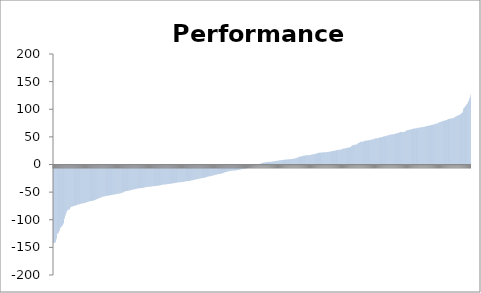
| Category | Series 0 |
|---|---|
| 0 | -141.152 |
| 1 | -140.612 |
| 2 | -140.332 |
| 3 | -139.602 |
| 4 | -139.222 |
| 5 | -138.582 |
| 6 | -133.712 |
| 7 | -131.642 |
| 8 | -123.992 |
| 9 | -122.942 |
| 10 | -122.612 |
| 11 | -121.252 |
| 12 | -118.902 |
| 13 | -118.055 |
| 14 | -113.951 |
| 15 | -112.112 |
| 16 | -111.724 |
| 17 | -110.475 |
| 18 | -109.845 |
| 19 | -108.628 |
| 20 | -107.068 |
| 21 | -105.483 |
| 22 | -103.914 |
| 23 | -96.913 |
| 24 | -95.021 |
| 25 | -91.298 |
| 26 | -88.384 |
| 27 | -86.844 |
| 28 | -83.245 |
| 29 | -82.327 |
| 30 | -80.121 |
| 31 | -80 |
| 32 | -79.958 |
| 33 | -79.51 |
| 34 | -78.965 |
| 35 | -76.961 |
| 36 | -75.333 |
| 37 | -74.779 |
| 38 | -74.728 |
| 39 | -74.539 |
| 40 | -74.305 |
| 41 | -73.76 |
| 42 | -73.428 |
| 43 | -73.284 |
| 44 | -72.699 |
| 45 | -72.6 |
| 46 | -72.447 |
| 47 | -72.027 |
| 48 | -71.899 |
| 49 | -71.405 |
| 50 | -71.113 |
| 51 | -70.995 |
| 52 | -70.223 |
| 53 | -70.13 |
| 54 | -70.081 |
| 55 | -69.986 |
| 56 | -69.733 |
| 57 | -69.202 |
| 58 | -69.089 |
| 59 | -68.904 |
| 60 | -68.807 |
| 61 | -68.518 |
| 62 | -68.225 |
| 63 | -68.107 |
| 64 | -68 |
| 65 | -67.736 |
| 66 | -67.671 |
| 67 | -67.417 |
| 68 | -66.529 |
| 69 | -66.507 |
| 70 | -66.268 |
| 71 | -65.949 |
| 72 | -65.677 |
| 73 | -65.225 |
| 74 | -65.031 |
| 75 | -64.737 |
| 76 | -64.715 |
| 77 | -64.495 |
| 78 | -64.322 |
| 79 | -64.242 |
| 80 | -63.983 |
| 81 | -63.883 |
| 82 | -63.672 |
| 83 | -63.465 |
| 84 | -63.434 |
| 85 | -63.083 |
| 86 | -62.654 |
| 87 | -62.548 |
| 88 | -61.479 |
| 89 | -61.225 |
| 90 | -61.089 |
| 91 | -60.736 |
| 92 | -60.51 |
| 93 | -60.007 |
| 94 | -59.339 |
| 95 | -59.216 |
| 96 | -58.82 |
| 97 | -58.113 |
| 98 | -57.874 |
| 99 | -57.76 |
| 100 | -57.751 |
| 101 | -56.774 |
| 102 | -56.155 |
| 103 | -56.1 |
| 104 | -56.048 |
| 105 | -55.707 |
| 106 | -55.702 |
| 107 | -55.691 |
| 108 | -55.585 |
| 109 | -54.988 |
| 110 | -54.887 |
| 111 | -54.78 |
| 112 | -54.6 |
| 113 | -54.54 |
| 114 | -54.348 |
| 115 | -54.208 |
| 116 | -54.139 |
| 117 | -53.649 |
| 118 | -53.638 |
| 119 | -53.418 |
| 120 | -53.378 |
| 121 | -53.165 |
| 122 | -53.111 |
| 123 | -53.047 |
| 124 | -52.97 |
| 125 | -52.928 |
| 126 | -52.37 |
| 127 | -52.348 |
| 128 | -52.064 |
| 129 | -51.863 |
| 130 | -51.857 |
| 131 | -51.699 |
| 132 | -51.306 |
| 133 | -51.271 |
| 134 | -51.254 |
| 135 | -51.173 |
| 136 | -51.103 |
| 137 | -50.664 |
| 138 | -50.634 |
| 139 | -49.947 |
| 140 | -49.844 |
| 141 | -49.802 |
| 142 | -49.422 |
| 143 | -49.292 |
| 144 | -48.55 |
| 145 | -47.598 |
| 146 | -47.556 |
| 147 | -47.367 |
| 148 | -47.04 |
| 149 | -46.676 |
| 150 | -46.221 |
| 151 | -46.135 |
| 152 | -46.061 |
| 153 | -46.004 |
| 154 | -45.698 |
| 155 | -45.49 |
| 156 | -45.425 |
| 157 | -45.24 |
| 158 | -45.155 |
| 159 | -45.083 |
| 160 | -44.529 |
| 161 | -44.455 |
| 162 | -44.202 |
| 163 | -43.699 |
| 164 | -43.531 |
| 165 | -43.466 |
| 166 | -43.301 |
| 167 | -43.059 |
| 168 | -43.04 |
| 169 | -42.99 |
| 170 | -42.488 |
| 171 | -42.339 |
| 172 | -42.24 |
| 173 | -41.846 |
| 174 | -41.732 |
| 175 | -41.454 |
| 176 | -41.307 |
| 177 | -41.211 |
| 178 | -41.134 |
| 179 | -41.093 |
| 180 | -40.919 |
| 181 | -40.878 |
| 182 | -40.861 |
| 183 | -40.814 |
| 184 | -40.764 |
| 185 | -40.566 |
| 186 | -40.482 |
| 187 | -39.968 |
| 188 | -39.96 |
| 189 | -39.563 |
| 190 | -39.434 |
| 191 | -39.294 |
| 192 | -39.083 |
| 193 | -39.027 |
| 194 | -39.005 |
| 195 | -38.926 |
| 196 | -38.856 |
| 197 | -38.544 |
| 198 | -38.413 |
| 199 | -38.296 |
| 200 | -38.24 |
| 201 | -38 |
| 202 | -37.952 |
| 203 | -37.948 |
| 204 | -37.727 |
| 205 | -37.51 |
| 206 | -37.488 |
| 207 | -37.488 |
| 208 | -37.412 |
| 209 | -36.986 |
| 210 | -36.949 |
| 211 | -36.893 |
| 212 | -36.891 |
| 213 | -36.798 |
| 214 | -36.548 |
| 215 | -36.544 |
| 216 | -36.441 |
| 217 | -36.37 |
| 218 | -36.151 |
| 219 | -36.108 |
| 220 | -36.05 |
| 221 | -35.892 |
| 222 | -35.56 |
| 223 | -35.31 |
| 224 | -35.287 |
| 225 | -34.76 |
| 226 | -34.727 |
| 227 | -34.561 |
| 228 | -34.297 |
| 229 | -34.274 |
| 230 | -34.272 |
| 231 | -34.267 |
| 232 | -34.191 |
| 233 | -34.164 |
| 234 | -34.103 |
| 235 | -33.682 |
| 236 | -33.591 |
| 237 | -33.548 |
| 238 | -33.447 |
| 239 | -33.385 |
| 240 | -32.991 |
| 241 | -32.953 |
| 242 | -32.943 |
| 243 | -32.638 |
| 244 | -32.603 |
| 245 | -32.458 |
| 246 | -32.432 |
| 247 | -32.323 |
| 248 | -32.116 |
| 249 | -31.99 |
| 250 | -31.783 |
| 251 | -31.663 |
| 252 | -31.482 |
| 253 | -31.276 |
| 254 | -31.215 |
| 255 | -31.137 |
| 256 | -30.952 |
| 257 | -30.678 |
| 258 | -30.659 |
| 259 | -30.441 |
| 260 | -30.362 |
| 261 | -30.333 |
| 262 | -30.219 |
| 263 | -30.173 |
| 264 | -29.965 |
| 265 | -29.835 |
| 266 | -29.781 |
| 267 | -29.693 |
| 268 | -29.65 |
| 269 | -29.495 |
| 270 | -29.336 |
| 271 | -29.094 |
| 272 | -28.936 |
| 273 | -28.931 |
| 274 | -28.591 |
| 275 | -28.581 |
| 276 | -28.46 |
| 277 | -28.162 |
| 278 | -28.156 |
| 279 | -28.06 |
| 280 | -27.973 |
| 281 | -27.919 |
| 282 | -27.756 |
| 283 | -27.382 |
| 284 | -27.176 |
| 285 | -26.827 |
| 286 | -26.81 |
| 287 | -26.749 |
| 288 | -26.587 |
| 289 | -26.426 |
| 290 | -26.389 |
| 291 | -26.099 |
| 292 | -25.876 |
| 293 | -25.43 |
| 294 | -25.16 |
| 295 | -25.012 |
| 296 | -24.984 |
| 297 | -24.914 |
| 298 | -24.862 |
| 299 | -24.56 |
| 300 | -24.16 |
| 301 | -24.055 |
| 302 | -23.744 |
| 303 | -23.461 |
| 304 | -23.34 |
| 305 | -23.24 |
| 306 | -22.931 |
| 307 | -22.646 |
| 308 | -22.53 |
| 309 | -22.435 |
| 310 | -22.238 |
| 311 | -22.078 |
| 312 | -22.026 |
| 313 | -21.928 |
| 314 | -21.85 |
| 315 | -21.719 |
| 316 | -21.079 |
| 317 | -20.263 |
| 318 | -20.146 |
| 319 | -20.112 |
| 320 | -19.777 |
| 321 | -19.702 |
| 322 | -19.539 |
| 323 | -19.396 |
| 324 | -19.38 |
| 325 | -19.327 |
| 326 | -18.575 |
| 327 | -18.503 |
| 328 | -18.487 |
| 329 | -18.405 |
| 330 | -18.346 |
| 331 | -17.785 |
| 332 | -17.37 |
| 333 | -17.335 |
| 334 | -16.982 |
| 335 | -16.805 |
| 336 | -16.669 |
| 337 | -16.529 |
| 338 | -16.053 |
| 339 | -16.048 |
| 340 | -15.491 |
| 341 | -15.487 |
| 342 | -15.48 |
| 343 | -15.457 |
| 344 | -15.17 |
| 345 | -14.826 |
| 346 | -14.732 |
| 347 | -14.512 |
| 348 | -13.917 |
| 349 | -13.889 |
| 350 | -13.863 |
| 351 | -13.786 |
| 352 | -13.267 |
| 353 | -12.884 |
| 354 | -12.13 |
| 355 | -12.092 |
| 356 | -11.822 |
| 357 | -11.781 |
| 358 | -11.508 |
| 359 | -11.494 |
| 360 | -11.329 |
| 361 | -10.56 |
| 362 | -10.522 |
| 363 | -10.206 |
| 364 | -10.065 |
| 365 | -10.034 |
| 366 | -9.91 |
| 367 | -9.674 |
| 368 | -9.659 |
| 369 | -9.365 |
| 370 | -9.354 |
| 371 | -9.152 |
| 372 | -9.081 |
| 373 | -9.036 |
| 374 | -8.858 |
| 375 | -8.857 |
| 376 | -8.844 |
| 377 | -8.638 |
| 378 | -8.462 |
| 379 | -8.44 |
| 380 | -8.361 |
| 381 | -8.206 |
| 382 | -7.859 |
| 383 | -7.71 |
| 384 | -7.513 |
| 385 | -7.34 |
| 386 | -7.297 |
| 387 | -6.952 |
| 388 | -6.884 |
| 389 | -6.843 |
| 390 | -6.651 |
| 391 | -6.494 |
| 392 | -6.283 |
| 393 | -6.258 |
| 394 | -5.97 |
| 395 | -5.908 |
| 396 | -5.784 |
| 397 | -5.698 |
| 398 | -5.501 |
| 399 | -5.087 |
| 400 | -4.876 |
| 401 | -4.201 |
| 402 | -4.158 |
| 403 | -3.745 |
| 404 | -3.742 |
| 405 | -3.682 |
| 406 | -3.466 |
| 407 | -3.027 |
| 408 | -2.454 |
| 409 | -2.215 |
| 410 | -2.009 |
| 411 | -1.66 |
| 412 | -1.547 |
| 413 | -1.021 |
| 414 | -0.974 |
| 415 | -0.839 |
| 416 | -0.707 |
| 417 | -0.215 |
| 418 | -0.16 |
| 419 | -0.152 |
| 420 | -0.096 |
| 421 | 0.044 |
| 422 | 0.229 |
| 423 | 0.465 |
| 424 | 0.729 |
| 425 | 0.992 |
| 426 | 1.034 |
| 427 | 1.314 |
| 428 | 1.371 |
| 429 | 2.219 |
| 430 | 2.624 |
| 431 | 2.954 |
| 432 | 2.997 |
| 433 | 3.03 |
| 434 | 3.415 |
| 435 | 3.495 |
| 436 | 3.497 |
| 437 | 3.815 |
| 438 | 3.866 |
| 439 | 4.107 |
| 440 | 4.314 |
| 441 | 4.392 |
| 442 | 4.407 |
| 443 | 4.427 |
| 444 | 4.628 |
| 445 | 4.707 |
| 446 | 4.75 |
| 447 | 4.767 |
| 448 | 5.082 |
| 449 | 5.098 |
| 450 | 5.103 |
| 451 | 5.121 |
| 452 | 5.281 |
| 453 | 5.379 |
| 454 | 5.448 |
| 455 | 5.745 |
| 456 | 5.807 |
| 457 | 6.107 |
| 458 | 6.276 |
| 459 | 6.355 |
| 460 | 6.487 |
| 461 | 6.913 |
| 462 | 6.928 |
| 463 | 6.932 |
| 464 | 7.001 |
| 465 | 7.243 |
| 466 | 7.604 |
| 467 | 7.768 |
| 468 | 7.799 |
| 469 | 7.823 |
| 470 | 7.904 |
| 471 | 8.12 |
| 472 | 8.182 |
| 473 | 8.216 |
| 474 | 8.281 |
| 475 | 8.432 |
| 476 | 8.495 |
| 477 | 8.612 |
| 478 | 8.751 |
| 479 | 8.926 |
| 480 | 9.013 |
| 481 | 9.121 |
| 482 | 9.197 |
| 483 | 9.206 |
| 484 | 9.238 |
| 485 | 9.43 |
| 486 | 9.565 |
| 487 | 9.565 |
| 488 | 9.592 |
| 489 | 9.65 |
| 490 | 9.66 |
| 491 | 9.759 |
| 492 | 9.944 |
| 493 | 10.055 |
| 494 | 10.131 |
| 495 | 10.285 |
| 496 | 10.702 |
| 497 | 10.706 |
| 498 | 10.871 |
| 499 | 11.219 |
| 500 | 11.262 |
| 501 | 11.78 |
| 502 | 12.262 |
| 503 | 12.324 |
| 504 | 12.521 |
| 505 | 12.764 |
| 506 | 13.904 |
| 507 | 13.915 |
| 508 | 13.958 |
| 509 | 14.165 |
| 510 | 14.635 |
| 511 | 14.646 |
| 512 | 14.78 |
| 513 | 14.805 |
| 514 | 15.228 |
| 515 | 15.509 |
| 516 | 15.617 |
| 517 | 15.763 |
| 518 | 15.815 |
| 519 | 15.943 |
| 520 | 16.134 |
| 521 | 16.516 |
| 522 | 16.531 |
| 523 | 16.599 |
| 524 | 16.747 |
| 525 | 16.764 |
| 526 | 16.9 |
| 527 | 16.953 |
| 528 | 16.983 |
| 529 | 17.021 |
| 530 | 17.096 |
| 531 | 17.396 |
| 532 | 17.587 |
| 533 | 17.885 |
| 534 | 18.465 |
| 535 | 18.484 |
| 536 | 18.562 |
| 537 | 18.635 |
| 538 | 18.664 |
| 539 | 18.811 |
| 540 | 19.062 |
| 541 | 19.294 |
| 542 | 19.631 |
| 543 | 19.667 |
| 544 | 20.6 |
| 545 | 20.809 |
| 546 | 20.948 |
| 547 | 21.081 |
| 548 | 21.113 |
| 549 | 21.139 |
| 550 | 21.387 |
| 551 | 21.443 |
| 552 | 21.518 |
| 553 | 21.545 |
| 554 | 21.763 |
| 555 | 21.851 |
| 556 | 21.902 |
| 557 | 21.993 |
| 558 | 22.009 |
| 559 | 22.246 |
| 560 | 22.263 |
| 561 | 22.288 |
| 562 | 22.292 |
| 563 | 22.302 |
| 564 | 22.361 |
| 565 | 22.432 |
| 566 | 22.439 |
| 567 | 22.582 |
| 568 | 22.898 |
| 569 | 23.055 |
| 570 | 23.246 |
| 571 | 23.383 |
| 572 | 23.526 |
| 573 | 23.677 |
| 574 | 24.113 |
| 575 | 24.263 |
| 576 | 24.336 |
| 577 | 24.488 |
| 578 | 24.611 |
| 579 | 24.687 |
| 580 | 24.707 |
| 581 | 24.716 |
| 582 | 25.275 |
| 583 | 25.407 |
| 584 | 25.565 |
| 585 | 26.12 |
| 586 | 26.125 |
| 587 | 26.224 |
| 588 | 26.51 |
| 589 | 26.565 |
| 590 | 26.587 |
| 591 | 26.615 |
| 592 | 26.775 |
| 593 | 26.961 |
| 594 | 27.773 |
| 595 | 27.777 |
| 596 | 28.014 |
| 597 | 28.017 |
| 598 | 28.862 |
| 599 | 28.988 |
| 600 | 29.096 |
| 601 | 29.174 |
| 602 | 29.342 |
| 603 | 29.687 |
| 604 | 29.695 |
| 605 | 29.962 |
| 606 | 30.004 |
| 607 | 30.309 |
| 608 | 30.384 |
| 609 | 30.855 |
| 610 | 31.159 |
| 611 | 31.26 |
| 612 | 31.296 |
| 613 | 31.448 |
| 614 | 31.561 |
| 615 | 33.322 |
| 616 | 34.411 |
| 617 | 34.872 |
| 618 | 34.887 |
| 619 | 34.948 |
| 620 | 35.385 |
| 621 | 35.53 |
| 622 | 35.756 |
| 623 | 35.921 |
| 624 | 36.198 |
| 625 | 36.34 |
| 626 | 36.414 |
| 627 | 36.987 |
| 628 | 38.105 |
| 629 | 38.909 |
| 630 | 39.159 |
| 631 | 39.289 |
| 632 | 39.603 |
| 633 | 41.043 |
| 634 | 41.325 |
| 635 | 41.331 |
| 636 | 41.38 |
| 637 | 41.398 |
| 638 | 41.578 |
| 639 | 41.768 |
| 640 | 41.851 |
| 641 | 42.206 |
| 642 | 42.805 |
| 643 | 42.928 |
| 644 | 43.083 |
| 645 | 43.09 |
| 646 | 43.139 |
| 647 | 43.397 |
| 648 | 43.542 |
| 649 | 43.63 |
| 650 | 43.642 |
| 651 | 44.219 |
| 652 | 44.232 |
| 653 | 44.32 |
| 654 | 44.43 |
| 655 | 44.596 |
| 656 | 44.904 |
| 657 | 45.152 |
| 658 | 45.51 |
| 659 | 45.514 |
| 660 | 45.651 |
| 661 | 45.741 |
| 662 | 45.819 |
| 663 | 46.84 |
| 664 | 46.993 |
| 665 | 47.302 |
| 666 | 47.461 |
| 667 | 47.559 |
| 668 | 47.578 |
| 669 | 47.622 |
| 670 | 47.907 |
| 671 | 48.392 |
| 672 | 48.461 |
| 673 | 48.691 |
| 674 | 48.833 |
| 675 | 49.28 |
| 676 | 49.378 |
| 677 | 49.492 |
| 678 | 49.746 |
| 679 | 49.772 |
| 680 | 50.237 |
| 681 | 50.7 |
| 682 | 50.801 |
| 683 | 51.098 |
| 684 | 51.137 |
| 685 | 51.208 |
| 686 | 51.437 |
| 687 | 51.974 |
| 688 | 52.006 |
| 689 | 52.273 |
| 690 | 52.328 |
| 691 | 52.404 |
| 692 | 53.186 |
| 693 | 53.59 |
| 694 | 53.803 |
| 695 | 54.124 |
| 696 | 54.259 |
| 697 | 54.312 |
| 698 | 54.337 |
| 699 | 54.544 |
| 700 | 54.552 |
| 701 | 54.618 |
| 702 | 54.746 |
| 703 | 54.995 |
| 704 | 54.997 |
| 705 | 55.62 |
| 706 | 55.751 |
| 707 | 56.199 |
| 708 | 56.439 |
| 709 | 56.578 |
| 710 | 56.756 |
| 711 | 57.2 |
| 712 | 57.367 |
| 713 | 57.484 |
| 714 | 57.814 |
| 715 | 58.434 |
| 716 | 58.674 |
| 717 | 58.725 |
| 718 | 58.782 |
| 719 | 58.815 |
| 720 | 58.917 |
| 721 | 58.956 |
| 722 | 58.983 |
| 723 | 59.031 |
| 724 | 59.319 |
| 725 | 59.358 |
| 726 | 59.691 |
| 727 | 60.48 |
| 728 | 61.631 |
| 729 | 62.012 |
| 730 | 62.203 |
| 731 | 62.393 |
| 732 | 62.522 |
| 733 | 62.561 |
| 734 | 62.96 |
| 735 | 63.368 |
| 736 | 63.565 |
| 737 | 63.574 |
| 738 | 63.769 |
| 739 | 63.894 |
| 740 | 63.974 |
| 741 | 64.216 |
| 742 | 64.806 |
| 743 | 64.971 |
| 744 | 65.161 |
| 745 | 65.249 |
| 746 | 65.331 |
| 747 | 65.348 |
| 748 | 65.457 |
| 749 | 65.677 |
| 750 | 65.79 |
| 751 | 65.958 |
| 752 | 66.319 |
| 753 | 66.428 |
| 754 | 66.536 |
| 755 | 66.69 |
| 756 | 66.754 |
| 757 | 66.771 |
| 758 | 67.094 |
| 759 | 67.246 |
| 760 | 67.371 |
| 761 | 67.585 |
| 762 | 67.875 |
| 763 | 67.95 |
| 764 | 68.137 |
| 765 | 68.226 |
| 766 | 68.243 |
| 767 | 68.784 |
| 768 | 69.242 |
| 769 | 69.362 |
| 770 | 69.556 |
| 771 | 69.71 |
| 772 | 69.76 |
| 773 | 69.993 |
| 774 | 70.208 |
| 775 | 70.258 |
| 776 | 70.499 |
| 777 | 70.577 |
| 778 | 70.915 |
| 779 | 71.197 |
| 780 | 71.358 |
| 781 | 71.387 |
| 782 | 71.97 |
| 783 | 72.022 |
| 784 | 72.108 |
| 785 | 72.598 |
| 786 | 72.969 |
| 787 | 73.363 |
| 788 | 73.598 |
| 789 | 73.65 |
| 790 | 73.805 |
| 791 | 73.936 |
| 792 | 74.526 |
| 793 | 74.875 |
| 794 | 75.587 |
| 795 | 75.809 |
| 796 | 76.462 |
| 797 | 76.613 |
| 798 | 76.697 |
| 799 | 76.965 |
| 800 | 77.418 |
| 801 | 77.74 |
| 802 | 78.22 |
| 803 | 78.615 |
| 804 | 78.914 |
| 805 | 78.965 |
| 806 | 79.115 |
| 807 | 79.411 |
| 808 | 79.993 |
| 809 | 80.082 |
| 810 | 80.177 |
| 811 | 80.38 |
| 812 | 80.473 |
| 813 | 81.286 |
| 814 | 81.753 |
| 815 | 82.248 |
| 816 | 82.398 |
| 817 | 82.588 |
| 818 | 82.778 |
| 819 | 82.808 |
| 820 | 83.108 |
| 821 | 83.318 |
| 822 | 83.488 |
| 823 | 83.658 |
| 824 | 83.848 |
| 825 | 84.288 |
| 826 | 84.308 |
| 827 | 85.038 |
| 828 | 85.928 |
| 829 | 86.138 |
| 830 | 86.878 |
| 831 | 86.968 |
| 832 | 88.048 |
| 833 | 88.078 |
| 834 | 88.698 |
| 835 | 89.038 |
| 836 | 89.448 |
| 837 | 89.568 |
| 838 | 89.978 |
| 839 | 90.408 |
| 840 | 91.788 |
| 841 | 91.888 |
| 842 | 93.048 |
| 843 | 93.358 |
| 844 | 94.668 |
| 845 | 97.498 |
| 846 | 101.328 |
| 847 | 102.298 |
| 848 | 102.298 |
| 849 | 104.928 |
| 850 | 105.518 |
| 851 | 106.048 |
| 852 | 107.588 |
| 853 | 109.428 |
| 854 | 109.718 |
| 855 | 112.098 |
| 856 | 114.008 |
| 857 | 115.608 |
| 858 | 117.998 |
| 859 | 121.438 |
| 860 | 121.458 |
| 861 | 126.708 |